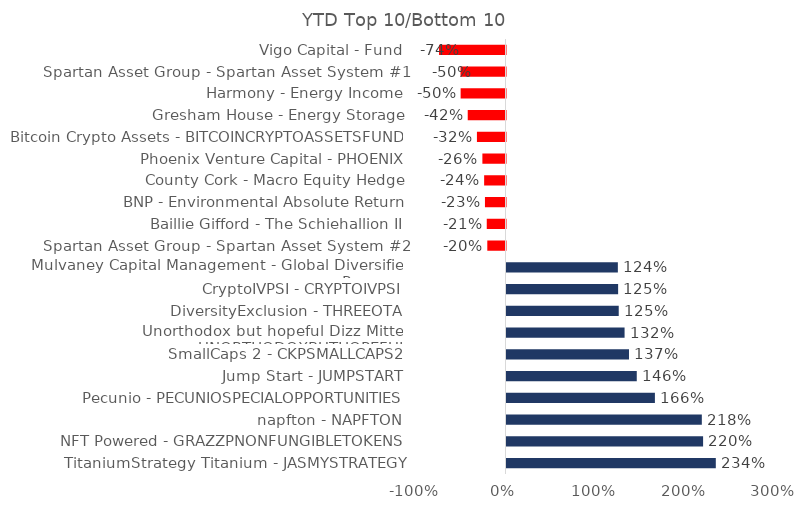
| Category | Series 0 |
|---|---|
| TitaniumStrategy Titanium - JASMYSTRATEGY | 2.339 |
| NFT Powered - GRAZZPNONFUNGIBLETOKENS | 2.197 |
| napfton - NAPFTON | 2.182 |
| Pecunio - PECUNIOSPECIALOPPORTUNITIES | 1.658 |
| Jump Start - JUMPSTART | 1.456 |
| SmallCaps 2 - CKPSMALLCAPS2 | 1.369 |
| Unorthodox but hopeful Dizz Mitte - UNORTHODOXBUTHOPEFUL | 1.319 |
| DiversityExclusion - THREEOTA | 1.254 |
| CryptoIVPSI - CRYPTOIVPSI | 1.247 |
| Mulvaney Capital Management - Global Diversified Program | 1.244 |
| Spartan Asset Group - Spartan Asset System #2 | -0.203 |
| Baillie Gifford - The Schiehallion II | -0.21 |
| BNP - Environmental Absolute Return | -0.23 |
| County Cork - Macro Equity Hedge | -0.239 |
| Phoenix Venture Capital - PHOENIX | -0.258 |
| Bitcoin Crypto Assets - BITCOINCRYPTOASSETSFUND | -0.319 |
| Gresham House - Energy Storage | -0.422 |
| Harmony - Energy Income | -0.501 |
| Spartan Asset Group - Spartan Asset System #1 | -0.503 |
| Vigo Capital - Fund | -0.742 |